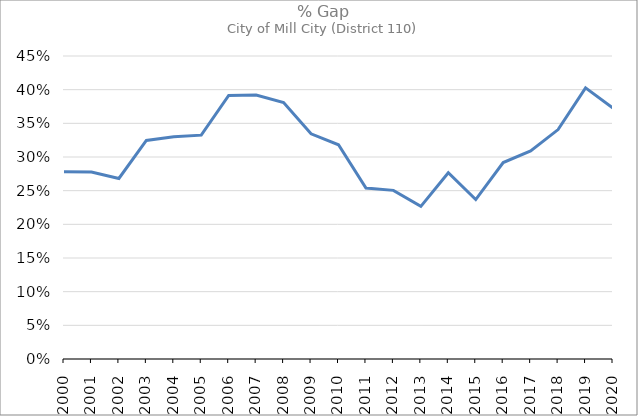
| Category | % Gap |
|---|---|
| 2000.0 | 0.278 |
| 2001.0 | 0.278 |
| 2002.0 | 0.268 |
| 2003.0 | 0.325 |
| 2004.0 | 0.33 |
| 2005.0 | 0.332 |
| 2006.0 | 0.391 |
| 2007.0 | 0.392 |
| 2008.0 | 0.381 |
| 2009.0 | 0.334 |
| 2010.0 | 0.318 |
| 2011.0 | 0.254 |
| 2012.0 | 0.25 |
| 2013.0 | 0.227 |
| 2014.0 | 0.277 |
| 2015.0 | 0.237 |
| 2016.0 | 0.292 |
| 2017.0 | 0.309 |
| 2018.0 | 0.341 |
| 2019.0 | 0.403 |
| 2020.0 | 0.373 |